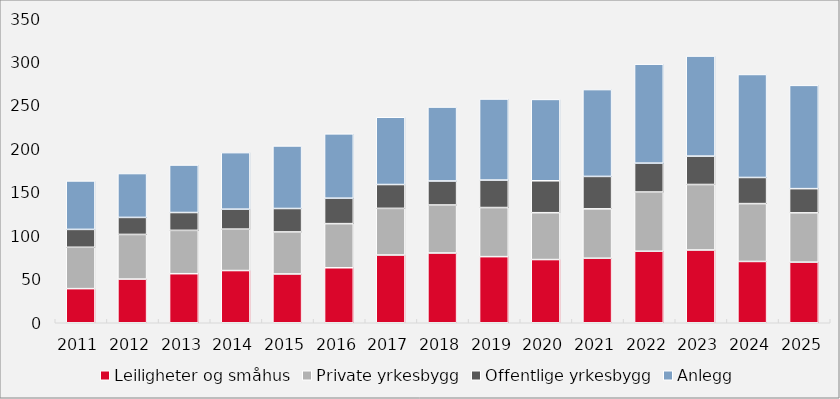
| Category | Leiligheter og småhus | Private yrkesbygg | Offentlige yrkesbygg | Anlegg |
|---|---|---|---|---|
| 2011.0 | 39.287 | 47.618 | 20.566 | 55.831 |
| 2012.0 | 50.282 | 51.403 | 19.591 | 50.516 |
| 2013.0 | 56.475 | 49.898 | 20.525 | 54.692 |
| 2014.0 | 60.107 | 47.69 | 22.961 | 65.112 |
| 2015.0 | 56.183 | 48.373 | 26.994 | 72.03 |
| 2016.0 | 63.311 | 50.808 | 29.277 | 74.068 |
| 2017.0 | 77.986 | 53.712 | 27.447 | 77.439 |
| 2018.0 | 80.318 | 55.253 | 27.635 | 85.121 |
| 2019.0 | 76.122 | 56.516 | 31.632 | 93.328 |
| 2020.0 | 72.762 | 53.942 | 36.752 | 93.667 |
| 2021.0 | 74.3 | 56.86 | 37.316 | 99.984 |
| 2022.0 | 82.313 | 68.206 | 33.238 | 113.945 |
| 2023.0 | 83.768 | 75.409 | 32.676 | 115.183 |
| 2024.0 | 70.563 | 66.615 | 30.078 | 118.581 |
| 2025.0 | 69.776 | 56.756 | 27.863 | 118.9 |